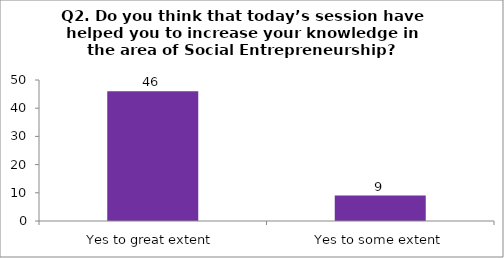
| Category | Q2. Do you think that today’s session have helped you to increase your knowledge in the area of Social Entrepreneurship? |
|---|---|
| Yes to great extent | 46 |
| Yes to some extent | 9 |